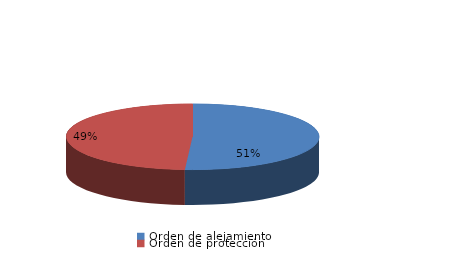
| Category | Series 0 |
|---|---|
| Orden de alejamiento | 80 |
| Orden de protección | 77 |